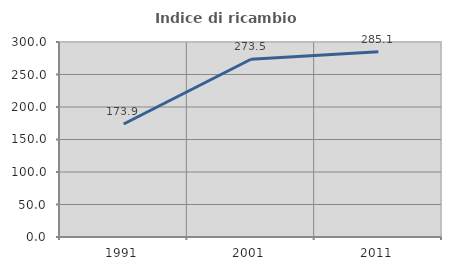
| Category | Indice di ricambio occupazionale  |
|---|---|
| 1991.0 | 173.853 |
| 2001.0 | 273.5 |
| 2011.0 | 285.091 |